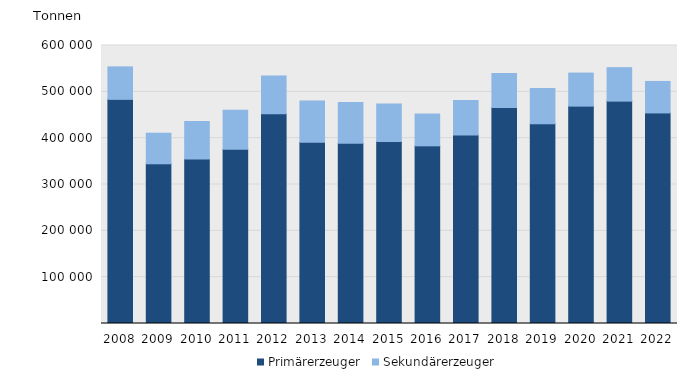
| Category | Primärerzeuger | Sekundärerzeuger |
|---|---|---|
| 2008.0 | 483769 | 70082 |
| 2009.0 | 344705 | 66025 |
| 2010.0 | 355164 | 80819 |
| 2011.0 | 375939 | 84429 |
| 2012.0 | 452834 | 81477 |
| 2013.0 | 391388 | 88807 |
| 2014.0 | 388854 | 88193 |
| 2015.0 | 392871 | 80689 |
| 2016.0 | 383445 | 68653 |
| 2017.0 | 407030 | 74519 |
| 2018.0 | 466122 | 73543 |
| 2019.0 | 431249 | 75688 |
| 2020.0 | 469172 | 71318 |
| 2021.0 | 479947 | 72258 |
| 2022.0 | 454448 | 67957 |